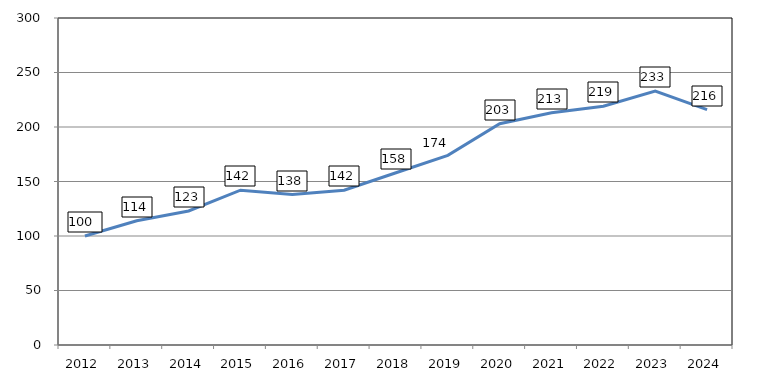
| Category | Series 0 |
|---|---|
| 2012.0 | 100 |
| 2013.0 | 114 |
| 2014.0 | 123 |
| 2015.0 | 142 |
| 2016.0 | 138 |
| 2017.0 | 142 |
| 2018.0 | 158 |
| 2019.0 | 174 |
| 2020.0 | 203 |
| 2021.0 | 213 |
| 2022.0 | 219 |
| 2023.0 | 233 |
| 2024.0 | 216 |